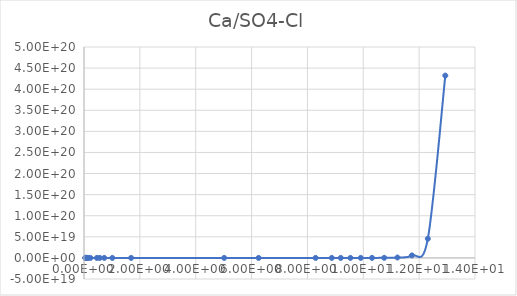
| Category | Series 0 |
|---|---|
| 0.045799 | 15.275 |
| 0.050887 | 15.525 |
| 0.057259 | 15.817 |
| 0.065457 | 16.166 |
| 0.076371 | 16.599 |
| 0.091686 | 17.17 |
| 0.11463 | 17.99 |
| 0.15299 | 19.365 |
| 0.22971 | 22.438 |
| 0.46165 | 37.343 |
| 0.56409 | 48.28 |
| 0.72494 | 74.58 |
| 1.0141 | 174.801 |
| 1.6871 | 1548.234 |
| 5.0184 | 230517985.927 |
| 6.2531 | 20577095349.605 |
| 8.2936 | 32198501872659.18 |
| 8.8726 | 248171809161342.94 |
| 9.1936 | 762288444408454.1 |
| 9.5386 | 2535168993866632 |
| 9.9106 | 9249700433219652 |
| 10.313 | 37634525491901296 |
| 10.749 | 174031007751937984 |
| 11.223 | 933175217409395456 |
| 11.742 | 5921438688789963776 |
| 12.311 | 45434830960854089728 |
| 12.937 | 432221886437661540352 |